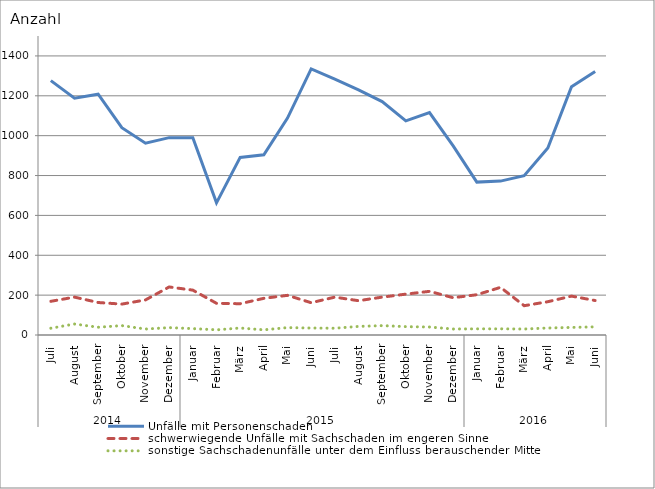
| Category | Unfälle mit Personenschaden | schwerwiegende Unfälle mit Sachschaden im engeren Sinne | sonstige Sachschadenunfälle unter dem Einfluss berauschender Mittel |
|---|---|---|---|
| 0 | 1276 | 169 | 34 |
| 1 | 1188 | 190 | 55 |
| 2 | 1208 | 163 | 39 |
| 3 | 1040 | 155 | 47 |
| 4 | 962 | 176 | 30 |
| 5 | 990 | 241 | 37 |
| 6 | 990 | 225 | 32 |
| 7 | 663 | 159 | 26 |
| 8 | 891 | 157 | 35 |
| 9 | 904 | 184 | 26 |
| 10 | 1088 | 199 | 37 |
| 11 | 1335 | 162 | 35 |
| 12 | 1284 | 190 | 34 |
| 13 | 1230 | 172 | 43 |
| 14 | 1171 | 190 | 47 |
| 15 | 1074 | 205 | 42 |
| 16 | 1116 | 219 | 40 |
| 17 | 949 | 187 | 30 |
| 18 | 767 | 202 | 31 |
| 19 | 772 | 239 | 31 |
| 20 | 799 | 147 | 30 |
| 21 | 938 | 167 | 35 |
| 22 | 1245 | 195 | 38 |
| 23 | 1322 | 173 | 41 |